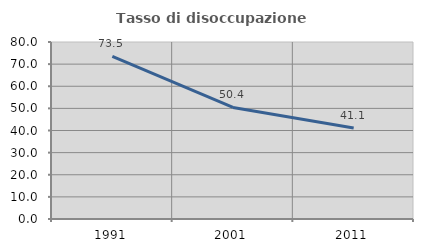
| Category | Tasso di disoccupazione giovanile  |
|---|---|
| 1991.0 | 73.455 |
| 2001.0 | 50.435 |
| 2011.0 | 41.111 |